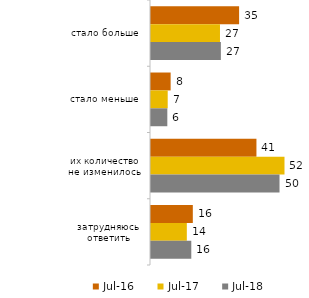
| Category | июл.16 | июл.17 | июл.18 |
|---|---|---|---|
| стало больше | 34.55 | 27.05 | 27.4 |
| стало меньше | 7.7 | 6.55 | 6.4 |
| их количество не изменилось | 41.35 | 52.35 | 50.4 |
| затрудняюсь ответить | 16.4 | 14.05 | 15.8 |